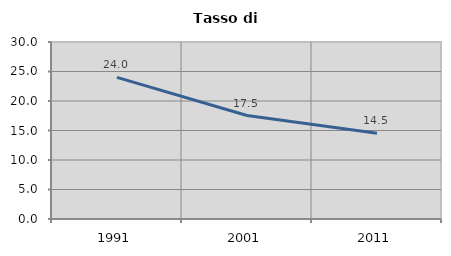
| Category | Tasso di disoccupazione   |
|---|---|
| 1991.0 | 24.01 |
| 2001.0 | 17.537 |
| 2011.0 | 14.547 |